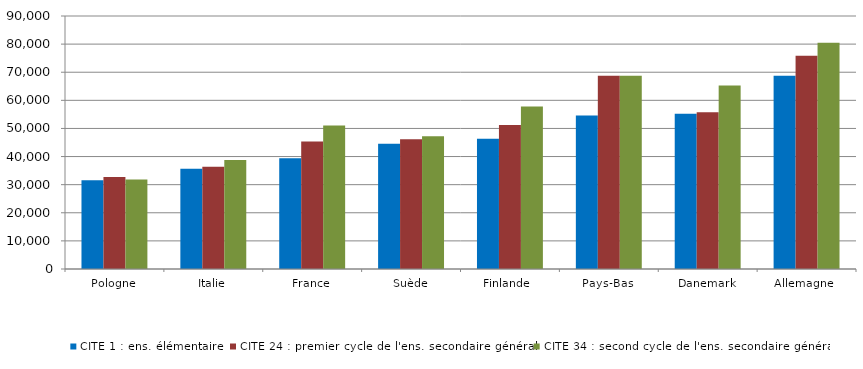
| Category | CITE 1 : ens. élémentaire | CITE 24 : premier cycle de l'ens. secondaire général | CITE 34 : second cycle de l'ens. secondaire général |
|---|---|---|---|
| Pologne | 31535.346 | 32687.852 | 31796.022 |
| Italie | 35646.852 | 36363.128 | 38814.897 |
| France | 39426.288 | 45374.73 | 51006.889 |
| Suède | 44548.681 | 46156.152 | 47255.275 |
| Finlande  | 46299.923 | 51193.581 | 57779.467 |
| Pays-Bas | 54598.494 | 68771.474 | 68771.474 |
| Danemark | 55227.148 | 55793.39 | 65272.263 |
| Allemagne  | 68747.008 | 75903.698 | 80482.653 |